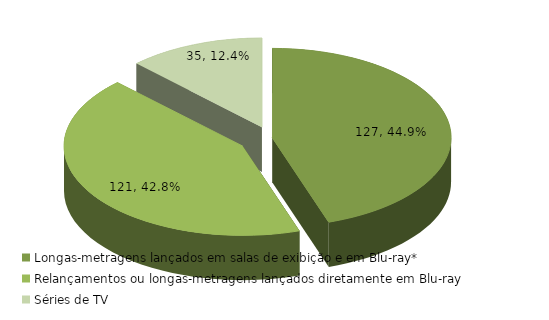
| Category | Series 0 |
|---|---|
| Longas-metragens lançados em salas de exibição e em Blu-ray* | 127 |
| Relançamentos ou longas-metragens lançados diretamente em Blu-ray | 121 |
| Séries de TV | 35 |